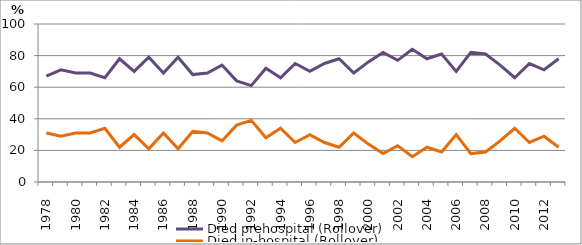
| Category | Died prehospital (Rollover) | Died in-hospital (Rollover) |
|---|---|---|
| 1978.0 | 67 | 31 |
| 1979.0 | 71 | 29 |
| 1980.0 | 69 | 31 |
| 1981.0 | 69 | 31 |
| 1982.0 | 66 | 34 |
| 1983.0 | 78 | 22 |
| 1984.0 | 70 | 30 |
| 1985.0 | 79 | 21 |
| 1986.0 | 69 | 31 |
| 1987.0 | 79 | 21 |
| 1988.0 | 68 | 32 |
| 1989.0 | 69 | 31 |
| 1990.0 | 74 | 26 |
| 1991.0 | 64 | 36 |
| 1992.0 | 61 | 39 |
| 1993.0 | 72 | 28 |
| 1994.0 | 66 | 34 |
| 1995.0 | 75 | 25 |
| 1996.0 | 70 | 30 |
| 1997.0 | 75 | 25 |
| 1998.0 | 78 | 22 |
| 1999.0 | 69 | 31 |
| 2000.0 | 76 | 24 |
| 2001.0 | 82 | 18 |
| 2002.0 | 77 | 23 |
| 2003.0 | 84 | 16 |
| 2004.0 | 78 | 22 |
| 2005.0 | 81 | 19 |
| 2006.0 | 70 | 30 |
| 2007.0 | 82 | 18 |
| 2008.0 | 81 | 19 |
| 2009.0 | 74 | 26 |
| 2010.0 | 66 | 34 |
| 2011.0 | 75 | 25 |
| 2012.0 | 71 | 29 |
| 2013.0 | 78 | 22 |